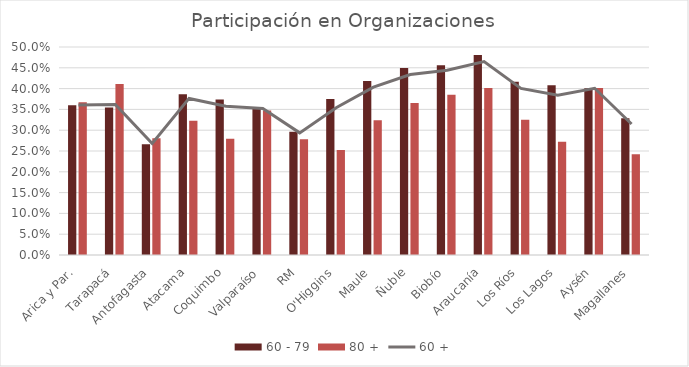
| Category | 60 - 79 | 80 + |
|---|---|---|
| Arica y Par. | 0.36 | 0.367 |
| Tarapacá | 0.354 | 0.411 |
| Antofagasta | 0.266 | 0.281 |
| Atacama | 0.386 | 0.323 |
| Coquimbo | 0.374 | 0.279 |
| Valparaíso | 0.353 | 0.347 |
| RM | 0.296 | 0.278 |
| O'Higgins | 0.375 | 0.252 |
| Maule | 0.418 | 0.324 |
| Ñuble | 0.45 | 0.365 |
| Biobío | 0.456 | 0.385 |
| Araucanía | 0.481 | 0.402 |
| Los Ríos | 0.416 | 0.325 |
| Los Lagos | 0.408 | 0.272 |
| Aysén | 0.401 | 0.401 |
| Magallanes | 0.329 | 0.242 |